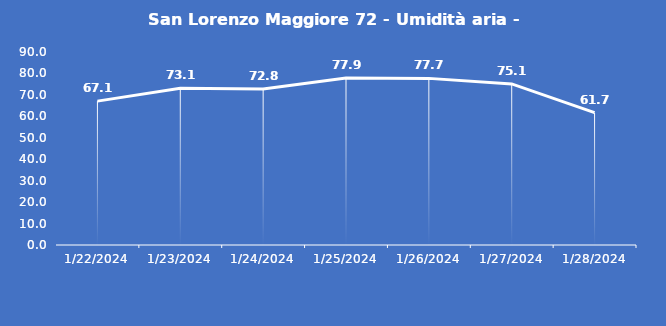
| Category | San Lorenzo Maggiore 72 - Umidità aria - Grezzo (%) |
|---|---|
| 1/22/24 | 67.1 |
| 1/23/24 | 73.1 |
| 1/24/24 | 72.8 |
| 1/25/24 | 77.9 |
| 1/26/24 | 77.7 |
| 1/27/24 | 75.1 |
| 1/28/24 | 61.7 |